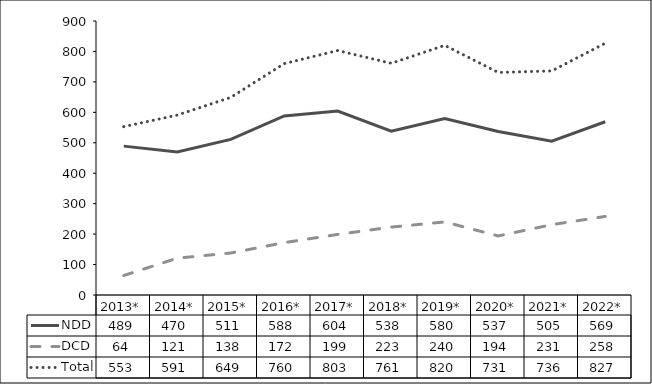
| Category | NDD | DCD | Total |
|---|---|---|---|
| 2013* | 489 | 64 | 553 |
| 2014* | 470 | 121 | 591 |
| 2015* | 511 | 138 | 649 |
| 2016* | 588 | 172 | 760 |
| 2017* | 604 | 199 | 803 |
| 2018* | 538 | 223 | 761 |
| 2019* | 580 | 240 | 820 |
| 2020* | 537 | 194 | 731 |
| 2021* | 505 | 231 | 736 |
| 2022* | 569 | 258 | 827 |